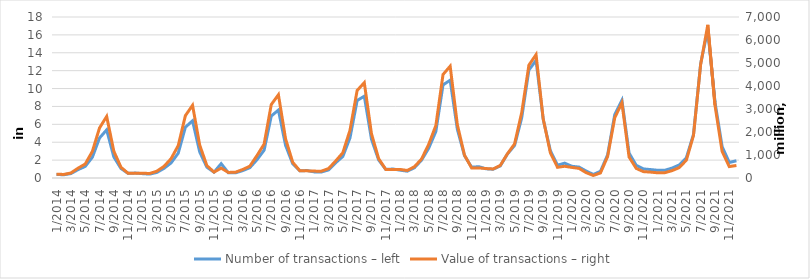
| Category | Number of transactions – left |
|---|---|
| 1/2014 | 397343 |
| 2/2014 | 361078 |
| 3/2014 | 493145 |
| 4/2014 | 934003 |
| 5/2014 | 1295388 |
| 6/2014 | 2322493 |
| 7/2014 | 4472930 |
| 8/2014 | 5380145 |
| 9/2014 | 2354410 |
| 10/2014 | 1061057 |
| 11/2014 | 515074 |
| 12/2014 | 552008 |
| 1/2015 | 487873 |
| 2/2015 | 434472 |
| 3/2015 | 618192 |
| 4/2015 | 1071368 |
| 5/2015 | 1684681 |
| 6/2015 | 2777989 |
| 7/2015 | 5680159 |
| 8/2015 | 6394748 |
| 9/2015 | 2918051 |
| 10/2015 | 1209535 |
| 11/2015 | 648645 |
| 12/2015 | 1601674 |
| 1/2016 | 584292 |
| 2/2016 | 574917 |
| 3/2016 | 823749 |
| 4/2016 | 1149524 |
| 5/2016 | 2038066 |
| 6/2016 | 3106484 |
| 7/2016 | 6928007 |
| 8/2016 | 7595443 |
| 9/2016 | 3649461 |
| 10/2016 | 1590986 |
| 11/2016 | 802784 |
| 12/2016 | 832600 |
| 1/2017 | 684062 |
| 2/2017 | 667841 |
| 3/2017 | 903419 |
| 4/2017 | 1701419 |
| 5/2017 | 2408336 |
| 6/2017 | 4486057 |
| 7/2017 | 8663549 |
| 8/2017 | 9142665 |
| 9/2017 | 4345036 |
| 10/2017 | 2028244 |
| 11/2017 | 958090 |
| 12/2017 | 1004475 |
| 1/2018 | 877554 |
| 2/2018 | 761371 |
| 3/2018 | 1143138 |
| 4/2018 | 1996709 |
| 5/2018 | 3328942 |
| 6/2018 | 5198448 |
| 7/2018 | 10409271 |
| 8/2018 | 10932790 |
| 9/2018 | 5457745 |
| 10/2018 | 2502920 |
| 11/2018 | 1207090 |
| 12/2018 | 1267869 |
| 1/2019 | 1030317 |
| 2/2019 | 978277 |
| 3/2019 | 1348516 |
| 4/2019 | 2678504 |
| 5/2019 | 3636139 |
| 6/2019 | 6740954 |
| 7/2019 | 12076123 |
| 8/2019 | 13149487 |
| 9/2019 | 6567510 |
| 10/2019 | 3056294 |
| 11/2019 | 1430865 |
| 12/2019 | 1661546 |
| 1/2020 | 1308423 |
| 2/2020 | 1222881 |
| 3/2020 | 778166 |
| 4/2020 | 397166 |
| 5/2020 | 743562 |
| 6/2020 | 2581424 |
| 7/2020 | 7099623 |
| 8/2020 | 8693227 |
| 9/2020 | 2787377 |
| 10/2020 | 1417314 |
| 11/2020 | 1014224 |
| 12/2020 | 943660 |
| 1/2021 | 862381 |
| 2/2021 | 864134 |
| 3/2021 | 1106983 |
| 4/2021 | 1455820 |
| 5/2021 | 2256337 |
| 6/2021 | 4864911 |
| 7/2021 | 12771584 |
| 8/2021 | 16618796 |
| 9/2021 | 8485574 |
| 10/2021 | 3520435 |
| 11/2021 | 1743758 |
| 12/2021 | 1930170 |